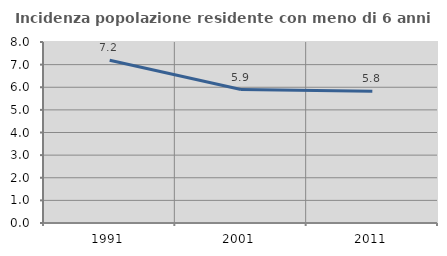
| Category | Incidenza popolazione residente con meno di 6 anni |
|---|---|
| 1991.0 | 7.194 |
| 2001.0 | 5.899 |
| 2011.0 | 5.824 |